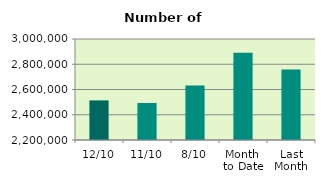
| Category | Series 0 |
|---|---|
| 12/10 | 2513634 |
| 11/10 | 2492938 |
| 8/10 | 2631890 |
| Month 
to Date | 2890334 |
| Last
Month | 2759252.364 |